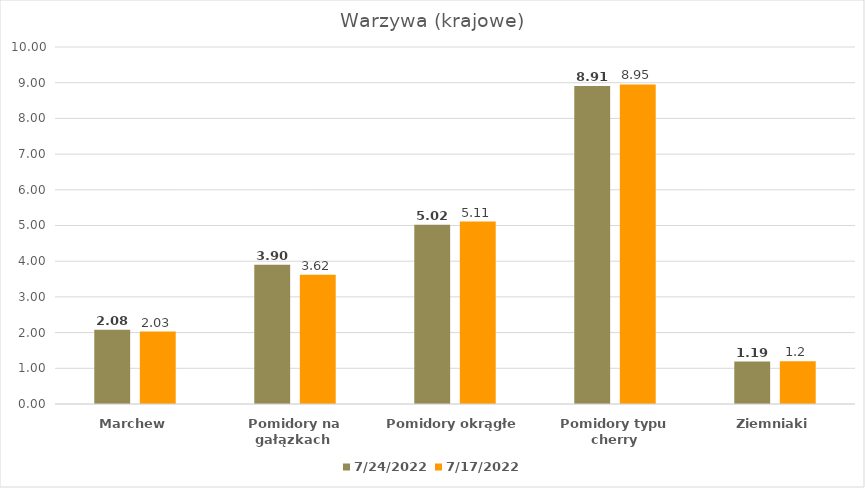
| Category | 24.07.2022 | 17.07.2022 |
|---|---|---|
| Marchew | 2.08 | 2.03 |
| Pomidory na gałązkach  | 3.9 | 3.62 |
| Pomidory okrągłe | 5.02 | 5.11 |
| Pomidory typu cherry | 8.91 | 8.95 |
| Ziemniaki | 1.19 | 1.2 |